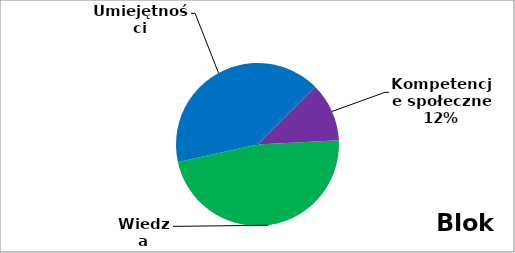
| Category | Series 0 |
|---|---|
| 0 | 155 |
| 1 | 134 |
| 2 | 38 |